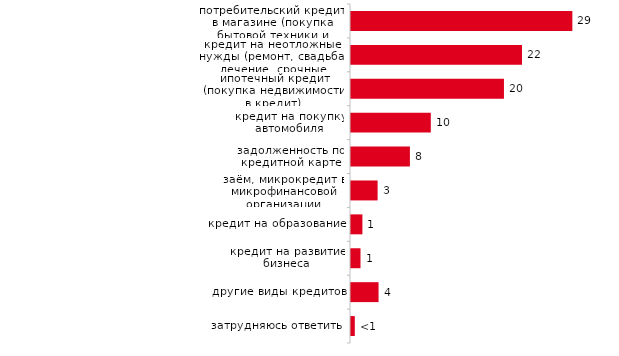
| Category | Series 0 |
|---|---|
| потребительский кредит в магазине (покупка бытовой техники и других товаров) | 29.016 |
| кредит на неотложные нужды (ремонт, свадьба, лечение, срочные покупки и т.д.) | 22.416 |
| ипотечный кредит (покупка недвижимости в кредит) | 20.05 |
| кредит на покупку автомобиля | 10.461 |
| задолженность по кредитной карте | 7.721 |
| заём, микрокредит в микрофинансовой организации | 3.487 |
| кредит на образование | 1.494 |
| кредит на развитие бизнеса | 1.245 |
| другие виды кредитов | 3.611 |
| затрудняюсь ответить | 0.498 |